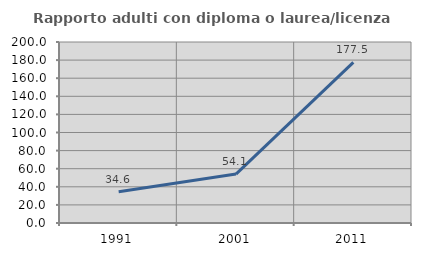
| Category | Rapporto adulti con diploma o laurea/licenza media  |
|---|---|
| 1991.0 | 34.568 |
| 2001.0 | 54.054 |
| 2011.0 | 177.5 |